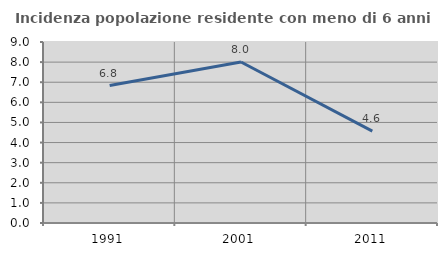
| Category | Incidenza popolazione residente con meno di 6 anni |
|---|---|
| 1991.0 | 6.835 |
| 2001.0 | 8.006 |
| 2011.0 | 4.567 |